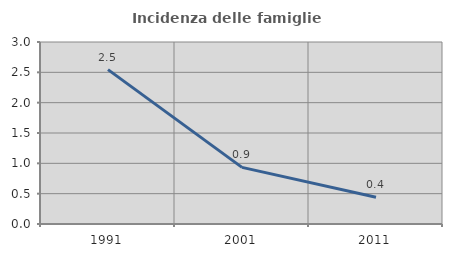
| Category | Incidenza delle famiglie numerose |
|---|---|
| 1991.0 | 2.545 |
| 2001.0 | 0.934 |
| 2011.0 | 0.442 |